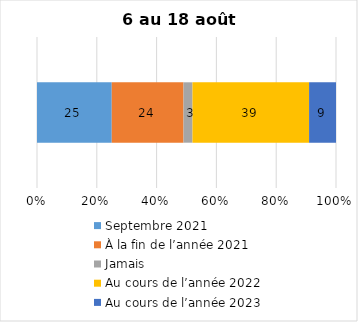
| Category | Septembre 2021 | À la fin de l’année 2021 | Jamais | Au cours de l’année 2022 | Au cours de l’année 2023 |
|---|---|---|---|---|---|
| 0 | 25 | 24 | 3 | 39 | 9 |